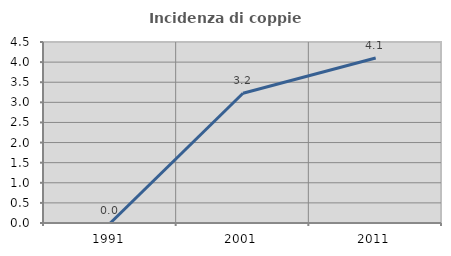
| Category | Incidenza di coppie miste |
|---|---|
| 1991.0 | 0 |
| 2001.0 | 3.226 |
| 2011.0 | 4.103 |